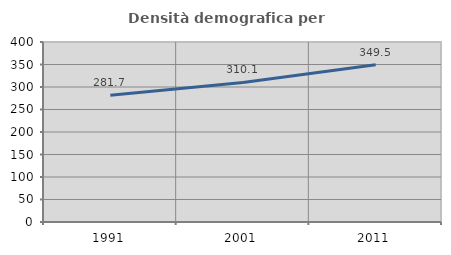
| Category | Densità demografica |
|---|---|
| 1991.0 | 281.704 |
| 2001.0 | 310.133 |
| 2011.0 | 349.546 |